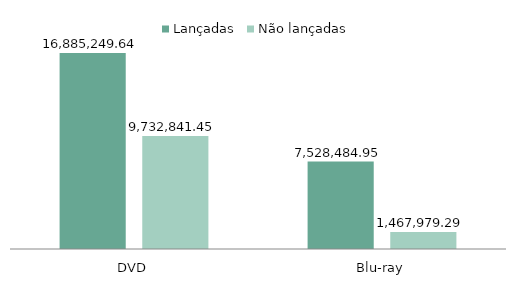
| Category | Lançadas | Não lançadas |
|---|---|---|
| DVD | 16885249.64 | 9732841.45 |
| Blu-ray | 7528484.95 | 1467979.29 |